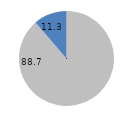
| Category | Series 0 |
|---|---|
| 0 | 88.7 |
| 1 | 11.3 |